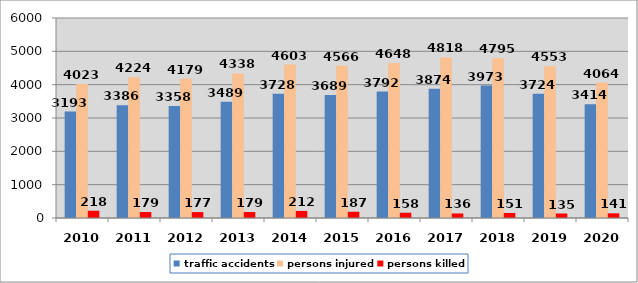
| Category | traffic accidents | persons injured | persons killed |
|---|---|---|---|
| 2010.0 | 3193 | 4023 | 218 |
| 2011.0 | 3386 | 4224 | 179 |
| 2012.0 | 3358 | 4179 | 177 |
| 2013.0 | 3489 | 4338 | 179 |
| 2014.0 | 3728 | 4603 | 212 |
| 2015.0 | 3689 | 4566 | 187 |
| 2016.0 | 3792 | 4648 | 158 |
| 2017.0 | 3874 | 4818 | 136 |
| 2018.0 | 3973 | 4795 | 151 |
| 2019.0 | 3724 | 4553 | 135 |
| 2020.0 | 3414 | 4064 | 141 |